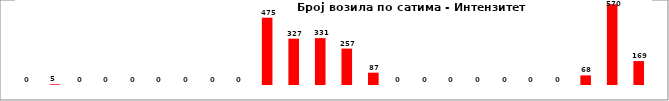
| Category | Series 0 |
|---|---|
| 0 | 0 |
| 1 | 5 |
| 2 | 0 |
| 3 | 0 |
| 4 | 0 |
| 5 | 0 |
| 6 | 0 |
| 7 | 0 |
| 8 | 0 |
| 9 | 475 |
| 10 | 327 |
| 11 | 331 |
| 12 | 257 |
| 13 | 87 |
| 14 | 0 |
| 15 | 0 |
| 16 | 0 |
| 17 | 0 |
| 18 | 0 |
| 19 | 0 |
| 20 | 0 |
| 21 | 68 |
| 22 | 570 |
| 23 | 169 |